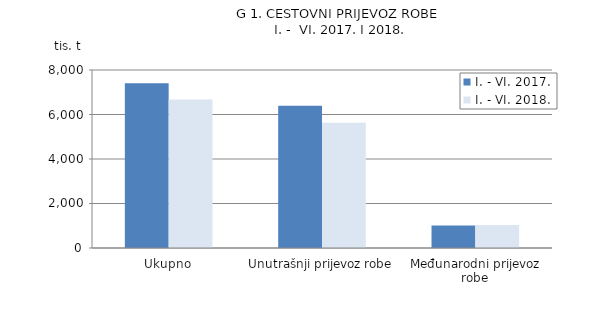
| Category | I. - VI. 2017. | I. - VI. 2018. |
|---|---|---|
| Ukupno | 7409 | 6671 |
| Unutrašnji prijevoz robe | 6398 | 5634 |
| Međunarodni prijevoz robe | 1011 | 1037 |